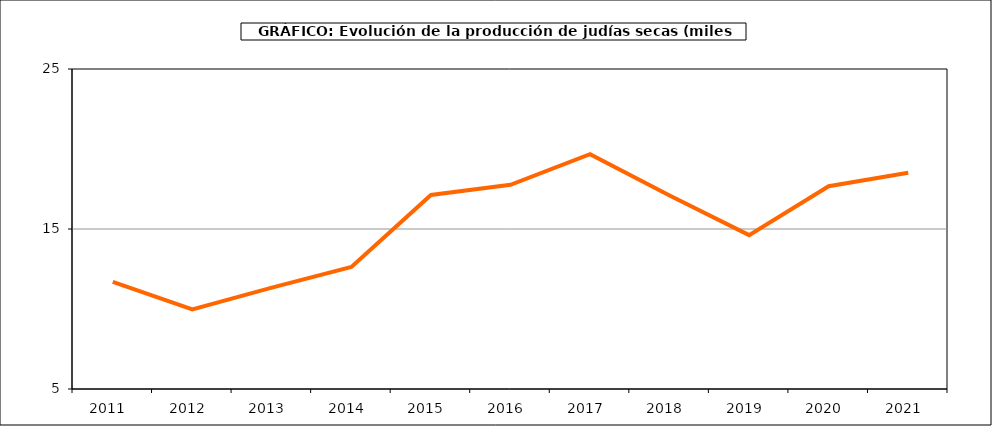
| Category | Superficie |
|---|---|
| 2011.0 | 11.701 |
| 2012.0 | 9.971 |
| 2013.0 | 11.337 |
| 2014.0 | 12.629 |
| 2015.0 | 17.125 |
| 2016.0 | 17.761 |
| 2017.0 | 19.675 |
| 2018.0 | 17.091 |
| 2019.0 | 14.615 |
| 2020.0 | 17.671 |
| 2021.0 | 18.521 |